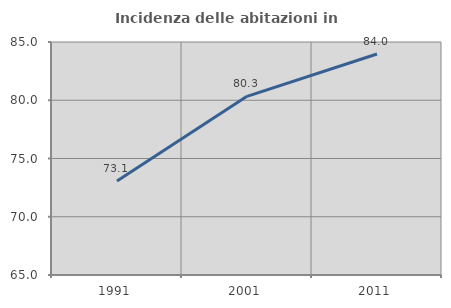
| Category | Incidenza delle abitazioni in proprietà  |
|---|---|
| 1991.0 | 73.059 |
| 2001.0 | 80.336 |
| 2011.0 | 83.97 |